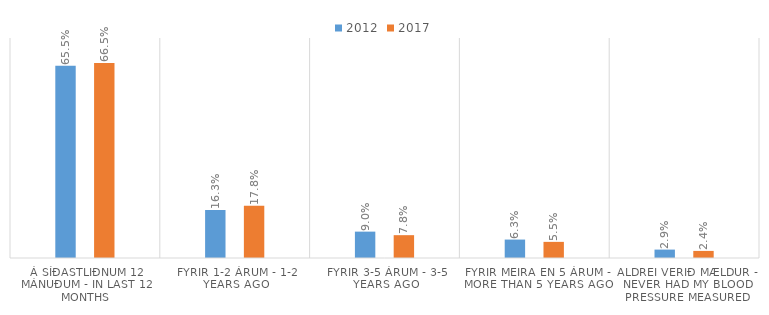
| Category | 2012 | 2017 |
|---|---|---|
| Á síðastliðnum 12 mánuðum - In last 12 months | 0.655 | 0.665 |
| Fyrir 1-2 árum - 1-2 years ago | 0.163 | 0.178 |
| Fyrir 3-5 árum - 3-5 years ago | 0.09 | 0.078 |
| Fyrir meira en 5 árum - More than 5 years ago | 0.063 | 0.055 |
| Aldrei verið mældur - Never had my blood pressure measured | 0.029 | 0.024 |